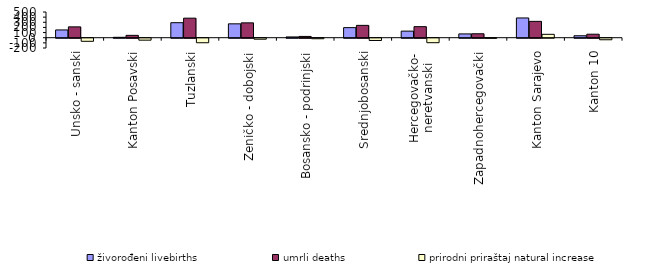
| Category | živorođeni livebirths | umrli deaths | prirodni priraštaj natural increase |
|---|---|---|---|
| Unsko - sanski | 151 | 211 | -60 |
| Kanton Posavski | 8 | 46 | -38 |
| Tuzlanski | 292 | 380 | -88 |
| Zeničko - dobojski | 270 | 289 | -19 |
| Bosansko - podrinjski | 15 | 25 | -10 |
| Srednjobosanski | 196 | 240 | -44 |
| Hercegovačko-
neretvanski | 128 | 215 | -87 |
| Zapadnohercegovački | 74 | 77 | -3 |
| Kanton Sarajevo | 384 | 318 | 66 |
| Kanton 10 | 38 | 68 | -30 |